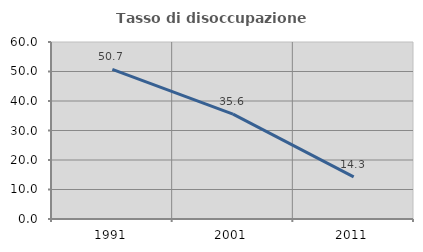
| Category | Tasso di disoccupazione giovanile  |
|---|---|
| 1991.0 | 50.704 |
| 2001.0 | 35.556 |
| 2011.0 | 14.286 |